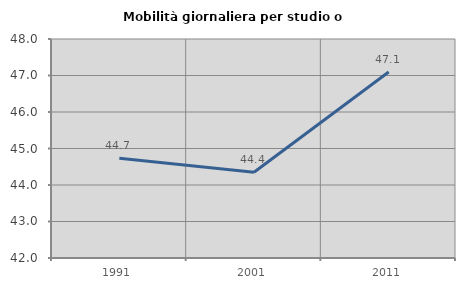
| Category | Mobilità giornaliera per studio o lavoro |
|---|---|
| 1991.0 | 44.732 |
| 2001.0 | 44.35 |
| 2011.0 | 47.095 |